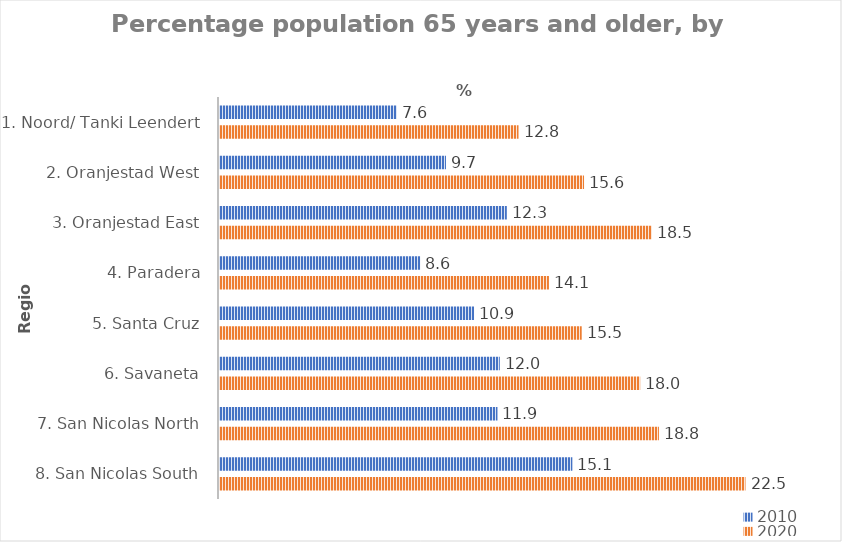
| Category | 2010 | 2020 |
|---|---|---|
| 1. Noord/ Tanki Leendert | 7.6 | 12.8 |
| 2. Oranjestad West | 9.7 | 15.6 |
| 3. Oranjestad East | 12.3 | 18.5 |
| 4. Paradera | 8.6 | 14.1 |
| 5. Santa Cruz | 10.9 | 15.5 |
| 6. Savaneta | 12 | 18 |
| 7. San Nicolas North | 11.9 | 18.8 |
| 8. San Nicolas South | 15.1 | 22.5 |